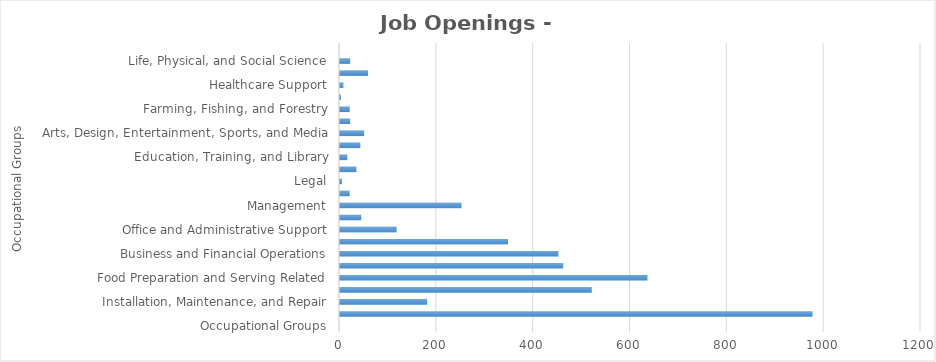
| Category | Series1 |
|---|---|
| Occupational Groups | 0 |
| Construction and Extraction | 976 |
| Installation, Maintenance, and Repair | 180 |
| Building and Grounds Cleaning and Maintenance | 520 |
| Food Preparation and Serving Related | 635 |
| Personal Care and Service | 461 |
| Business and Financial Operations | 451 |
| Sales and Related | 347 |
| Office and Administrative Support | 117 |
| Architecture and Engineering | 44 |
| Management | 251 |
| Transportation and Material Moving | 20 |
| Legal | 4 |
| Healthcare Practitioners and Technical | 34 |
| Education, Training, and Library | 15 |
| Production | 42 |
| Arts, Design, Entertainment, Sports, and Media | 50 |
| Computer and Mathematical | 21 |
| Farming, Fishing, and Forestry | 20 |
| Community and Social Services | 2 |
| Healthcare Support | 7 |
| Protective Service | 58 |
| Life, Physical, and Social Science | 21 |
| Military Specific  | 0 |